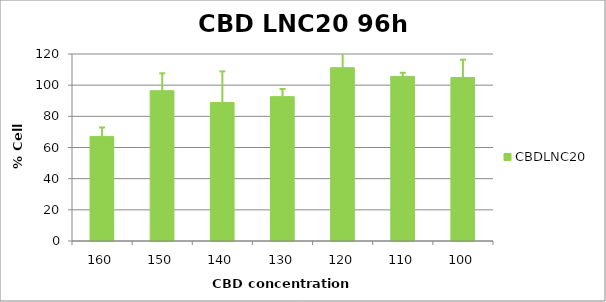
| Category | CBDLNC20 |
|---|---|
| 160.0 | 67.12 |
| 150.0 | 96.423 |
| 140.0 | 88.861 |
| 130.0 | 92.633 |
| 120.0 | 111.223 |
| 110.0 | 105.634 |
| 100.0 | 104.86 |